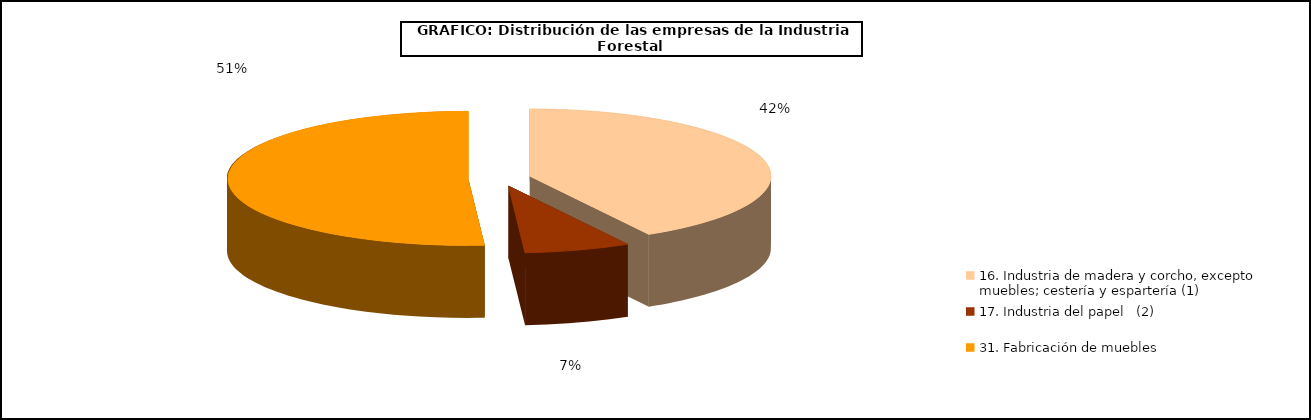
| Category | Series 0 |
|---|---|
| 16. Industria de madera y corcho, excepto  muebles; cestería y espartería (1) | 41.773 |
| 17. Industria del papel   (2) | 7.132 |
| 31. Fabricación de muebles  | 51.094 |